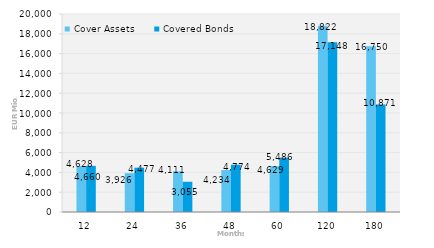
| Category | Cover Assets | Covered Bonds |
|---|---|---|
| 12.0 | 4628.435 | 4660.41 |
| 24.0 | 3925.889 | 4476.5 |
| 36.0 | 4111.356 | 3055 |
| 48.0 | 4233.508 | 4774.233 |
| 60.0 | 4628.977 | 5485.709 |
| 120.0 | 18821.948 | 17148.298 |
| 180.0 | 16749.694 | 10871.049 |